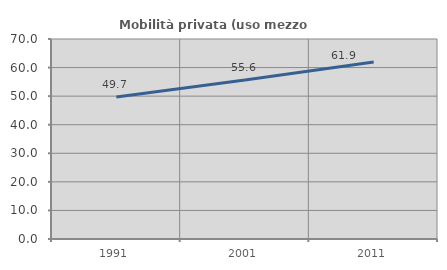
| Category | Mobilità privata (uso mezzo privato) |
|---|---|
| 1991.0 | 49.722 |
| 2001.0 | 55.647 |
| 2011.0 | 61.933 |